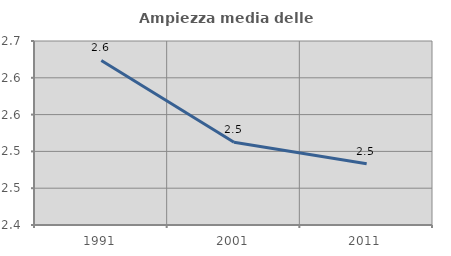
| Category | Ampiezza media delle famiglie |
|---|---|
| 1991.0 | 2.624 |
| 2001.0 | 2.512 |
| 2011.0 | 2.483 |